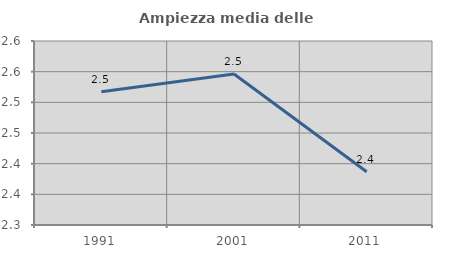
| Category | Ampiezza media delle famiglie |
|---|---|
| 1991.0 | 2.517 |
| 2001.0 | 2.546 |
| 2011.0 | 2.387 |